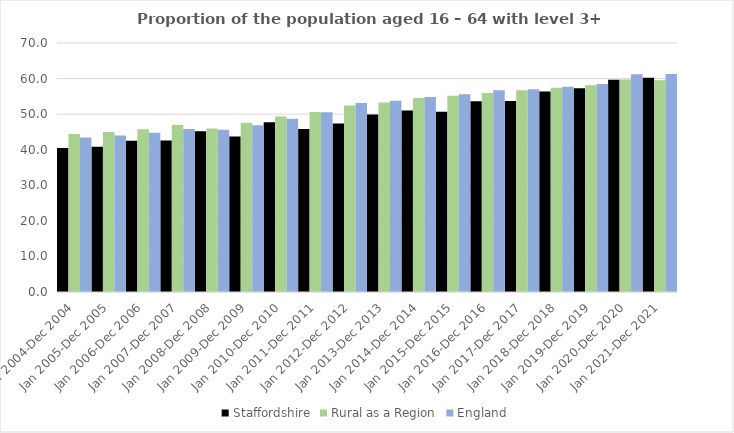
| Category | Staffordshire | Rural as a Region | England |
|---|---|---|---|
| Jan 2004-Dec 2004 | 40.5 | 44.405 | 43.4 |
| Jan 2005-Dec 2005 | 40.8 | 44.973 | 44 |
| Jan 2006-Dec 2006 | 42.5 | 45.774 | 44.8 |
| Jan 2007-Dec 2007 | 42.6 | 46.968 | 45.8 |
| Jan 2008-Dec 2008 | 45.2 | 45.964 | 45.6 |
| Jan 2009-Dec 2009 | 43.7 | 47.59 | 46.9 |
| Jan 2010-Dec 2010 | 47.7 | 49.362 | 48.7 |
| Jan 2011-Dec 2011 | 45.8 | 50.602 | 50.5 |
| Jan 2012-Dec 2012 | 47.4 | 52.439 | 53.1 |
| Jan 2013-Dec 2013 | 49.9 | 53.276 | 53.8 |
| Jan 2014-Dec 2014 | 51 | 54.57 | 54.8 |
| Jan 2015-Dec 2015 | 50.7 | 55.16 | 55.6 |
| Jan 2016-Dec 2016 | 53.6 | 55.941 | 56.7 |
| Jan 2017-Dec 2017 | 53.7 | 56.689 | 57 |
| Jan 2018-Dec 2018 | 56.4 | 57.389 | 57.7 |
| Jan 2019-Dec 2019 | 57.3 | 58.147 | 58.5 |
| Jan 2020-Dec 2020 | 59.7 | 59.771 | 61.2 |
| Jan 2021-Dec 2021 | 60.2 | 59.54 | 61.3 |